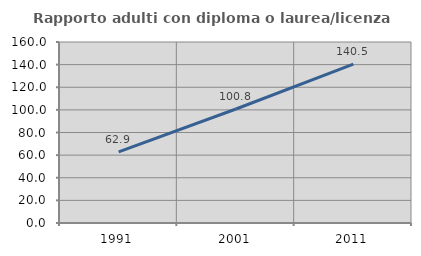
| Category | Rapporto adulti con diploma o laurea/licenza media  |
|---|---|
| 1991.0 | 62.891 |
| 2001.0 | 100.782 |
| 2011.0 | 140.472 |